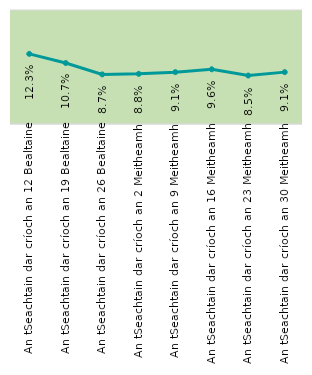
| Category | Series 0 |
|---|---|
| An tSeachtain dar críoch an 12 Bealtaine | 0.123 |
| An tSeachtain dar críoch an 19 Bealtaine | 0.107 |
| An tSeachtain dar críoch an 26 Bealtaine | 0.087 |
| An tSeachtain dar críoch an 2 Meitheamh | 0.088 |
| An tSeachtain dar críoch an 9 Meitheamh | 0.091 |
| An tSeachtain dar críoch an 16 Meitheamh | 0.096 |
| An tSeachtain dar críoch an 23 Meitheamh | 0.085 |
| An tSeachtain dar críoch an 30 Meitheamh | 0.091 |